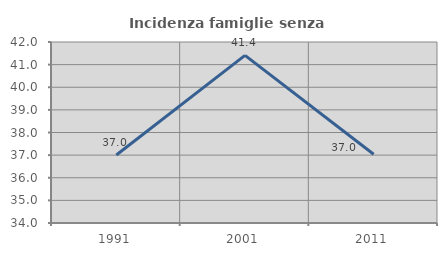
| Category | Incidenza famiglie senza nuclei |
|---|---|
| 1991.0 | 37.003 |
| 2001.0 | 41.408 |
| 2011.0 | 37.037 |